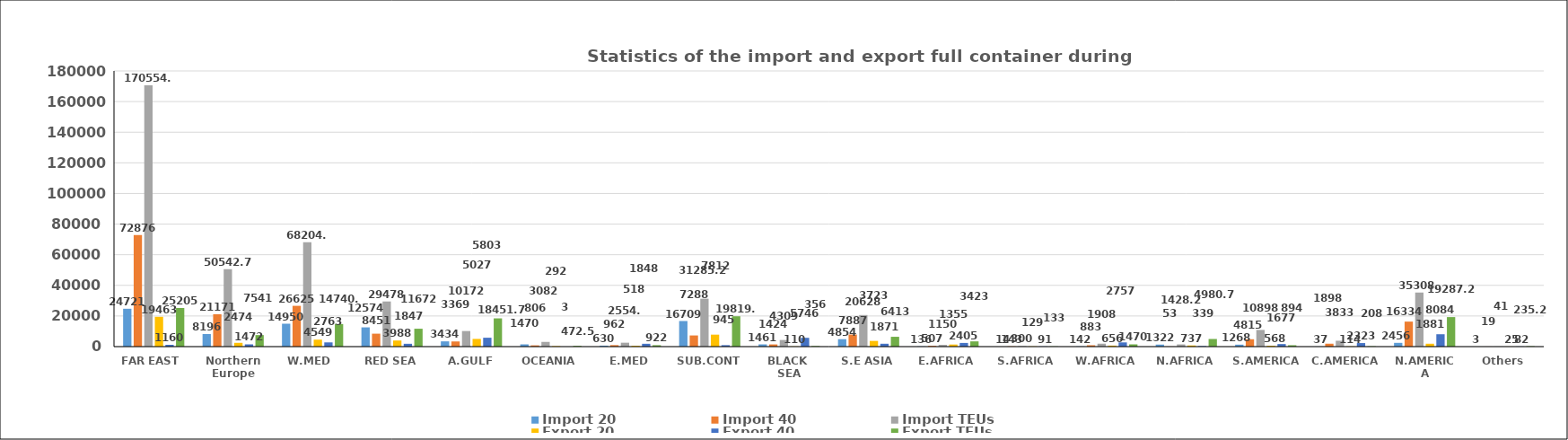
| Category | Import 20 | Import 40 | Import TEUs | Export 20 | Export 40 | Export TEUs |
|---|---|---|---|---|---|---|
| FAR EAST  | 24721 | 72876 | 170554.5 | 19463 | 1160 | 25205 |
| Northern Europe | 8196 | 21171 | 50542.75 | 2474 | 1472 | 7541 |
| W.MED  | 14950 | 26625 | 68204.5 | 4549 | 2763 | 14740.5 |
| RED SEA | 12574 | 8451 | 29478 | 3988 | 1847 | 11672 |
| A.GULF | 3434 | 3369 | 10172 | 5027 | 5803 | 18451.75 |
| OCEANIA | 1470 | 806 | 3082 | 292 | 3 | 472.5 |
| E.MED | 630 | 962 | 2554.5 | 518 | 1848 | 922 |
| SUB.CONT | 16709 | 7288 | 31285.25 | 7812 | 945 | 19819.5 |
| BLACK  SEA | 1461 | 1424 | 4309 | 110 | 5746 | 356 |
| S.E ASIA | 4854 | 7887 | 20628 | 3723 | 1871 | 6413 |
| E.AFRICA | 136 | 507 | 1150 | 1355 | 2405 | 3423 |
| S.AFRICA | 14 | 143 | 300 | 129 | 91 | 133 |
| W.AFRICA | 142 | 883 | 1908 | 656 | 2757 | 1470 |
| N.AFRICA | 1322 | 53 | 1428.25 | 737 | 339 | 4980.75 |
| S.AMERICA | 1268 | 4815 | 10898 | 568 | 1677 | 894 |
| C.AMERICA | 37 | 1898 | 3833 | 114 | 2323 | 208 |
| N.AMERICA | 2456 | 16334 | 35308.5 | 1881 | 8084 | 19287.25 |
| Others | 3 | 19 | 41 | 25 | 82 | 235.25 |